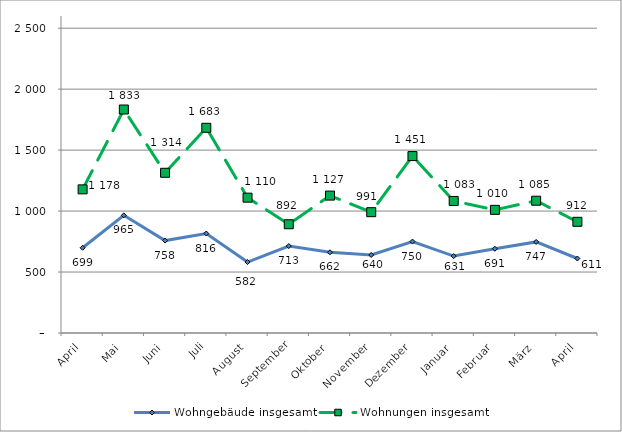
| Category | Wohngebäude insgesamt | Wohnungen insgesamt |
|---|---|---|
| April | 699 | 1178 |
| Mai | 965 | 1833 |
| Juni | 758 | 1314 |
| Juli | 816 | 1683 |
| August | 582 | 1110 |
| September | 713 | 892 |
| Oktober | 662 | 1127 |
| November | 640 | 991 |
| Dezember | 750 | 1451 |
| Januar | 631 | 1083 |
| Februar | 691 | 1010 |
| März | 747 | 1085 |
| April | 611 | 912 |